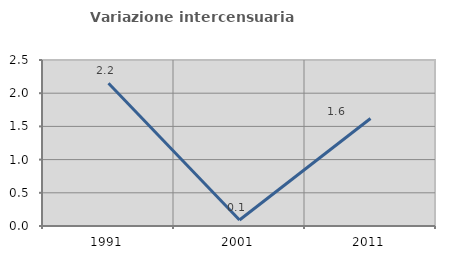
| Category | Variazione intercensuaria annua |
|---|---|
| 1991.0 | 2.151 |
| 2001.0 | 0.09 |
| 2011.0 | 1.62 |